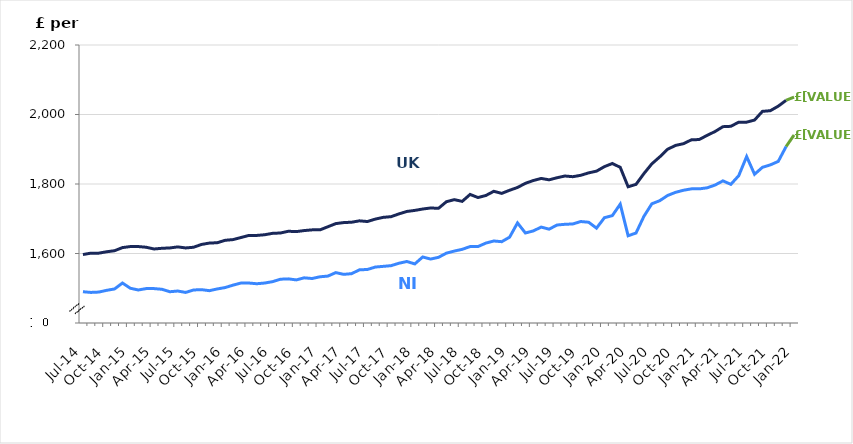
| Category | Series 0 | Series 1 |
|---|---|---|
| 2014-07-01 | 1490 | 1597 |
| 2014-08-01 | 1488 | 1601 |
| 2014-09-01 | 1489 | 1601 |
| 2014-10-01 | 1494 | 1605 |
| 2014-11-01 | 1498 | 1608 |
| 2014-12-01 | 1515 | 1617 |
| 2015-01-01 | 1500 | 1620 |
| 2015-02-01 | 1495 | 1620 |
| 2015-03-01 | 1499 | 1618 |
| 2015-04-01 | 1499 | 1613 |
| 2015-05-01 | 1497 | 1615 |
| 2015-06-01 | 1490 | 1616 |
| 2015-07-01 | 1492 | 1619 |
| 2015-08-01 | 1488 | 1616 |
| 2015-09-01 | 1495 | 1618 |
| 2015-10-01 | 1496 | 1626 |
| 2015-11-01 | 1493 | 1630 |
| 2015-12-01 | 1498 | 1631 |
| 2016-01-01 | 1502 | 1638 |
| 2016-02-01 | 1509 | 1640 |
| 2016-03-01 | 1515 | 1646 |
| 2016-04-01 | 1515 | 1652 |
| 2016-05-01 | 1513 | 1652 |
| 2016-06-01 | 1515 | 1654 |
| 2016-07-01 | 1519 | 1658 |
| 2016-08-01 | 1526 | 1659 |
| 2016-09-01 | 1527 | 1664 |
| 2016-10-01 | 1524 | 1663 |
| 2016-11-01 | 1530 | 1666 |
| 2016-12-01 | 1528 | 1668 |
| 2017-01-01 | 1533 | 1668 |
| 2017-02-01 | 1535 | 1677 |
| 2017-03-01 | 1545 | 1686 |
| 2017-04-01 | 1540 | 1689 |
| 2017-05-01 | 1542 | 1690 |
| 2017-06-01 | 1553 | 1694 |
| 2017-07-01 | 1554 | 1692 |
| 2017-08-01 | 1561 | 1699 |
| 2017-09-01 | 1563 | 1704 |
| 2017-10-01 | 1565 | 1706 |
| 2017-11-01 | 1572 | 1714 |
| 2017-12-01 | 1577 | 1721 |
| 2018-01-01 | 1570 | 1724 |
| 2018-02-01 | 1590 | 1728 |
| 2018-03-01 | 1584 | 1731 |
| 2018-04-01 | 1589 | 1730 |
| 2018-05-01 | 1601 | 1749 |
| 2018-06-01 | 1607 | 1755 |
| 2018-07-01 | 1612 | 1750 |
| 2018-08-01 | 1620 | 1770 |
| 2018-09-01 | 1620 | 1761 |
| 2018-10-01 | 1630 | 1767 |
| 2018-11-01 | 1636 | 1779 |
| 2018-12-01 | 1634 | 1773 |
| 2019-01-01 | 1647 | 1782 |
| 2019-02-01 | 1688 | 1790 |
| 2019-03-01 | 1659 | 1802 |
| 2019-04-01 | 1665 | 1810 |
| 2019-05-01 | 1676 | 1816 |
| 2019-06-01 | 1670 | 1812 |
| 2019-07-01 | 1682 | 1818 |
| 2019-08-01 | 1684 | 1823 |
| 2019-09-01 | 1685 | 1821 |
| 2019-10-01 | 1692 | 1825 |
| 2019-11-01 | 1690 | 1832 |
| 2019-12-01 | 1673 | 1837 |
| 2020-01-01 | 1703 | 1850 |
| 2020-02-01 | 1709 | 1859 |
| 2020-03-01 | 1742 | 1848 |
| 2020-04-01 | 1651 | 1792 |
| 2020-05-01 | 1659 | 1799 |
| 2020-06-01 | 1707 | 1830 |
| 2020-07-01 | 1743 | 1858 |
| 2020-08-01 | 1752 | 1878 |
| 2020-09-01 | 1767 | 1900 |
| 2020-10-01 | 1776 | 1911 |
| 2020-11-01 | 1782 | 1916 |
| 2020-12-01 | 1786 | 1927 |
| 2021-01-01 | 1786 | 1928 |
| 2021-02-01 | 1789 | 1940 |
| 2021-03-01 | 1797 | 1951 |
| 2021-04-01 | 1809 | 1965 |
| 2021-05-01 | 1799 | 1966 |
| 2021-06-01 | 1824 | 1978 |
| 2021-07-01 | 1879 | 1978 |
| 2021-08-01 | 1828 | 1984 |
| 2021-09-01 | 1848 | 2009 |
| 2021-10-01 | 1855 | 2011 |
| 2021-11-01 | 1865 | 2024 |
| 2021-12-01 | 1908 | 2041 |
| 2022-01-01 | 1941 | 2050 |